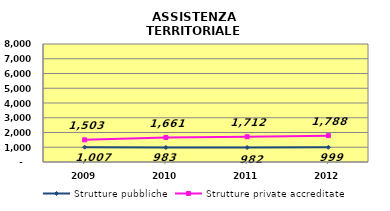
| Category | Strutture pubbliche | Strutture private accreditate |
|---|---|---|
| 2009.0 | 1007 | 1503 |
| 2010.0 | 983 | 1661 |
| 2011.0 | 982 | 1712 |
| 2012.0 | 999 | 1788 |